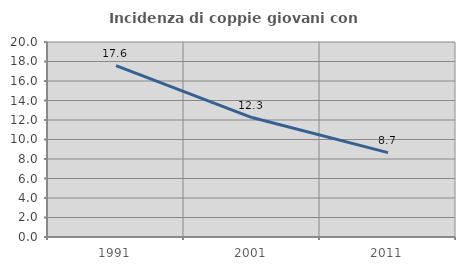
| Category | Incidenza di coppie giovani con figli |
|---|---|
| 1991.0 | 17.586 |
| 2001.0 | 12.251 |
| 2011.0 | 8.658 |